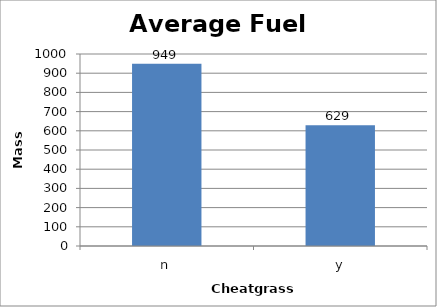
| Category | "Average Fuel Mass" |
|---|---|
| n | 949 |
| y | 628.571 |